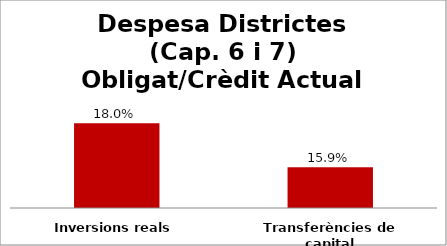
| Category | Series 0 |
|---|---|
| Inversions reals | 0.18 |
| Transferències de capital | 0.159 |